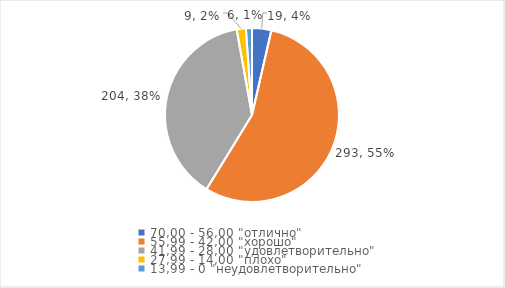
| Category | Series 0 | Series 1 |
|---|---|---|
| 70,00 - 56,00 "отлично" | 19 | 0.036 |
| 55,99 - 42,00 "хорошо" | 293 | 0.552 |
| 41,99 - 28,00 "удовлетворительно" | 204 | 0.384 |
| 27,99 - 14,00 "плохо" | 9 | 0.017 |
| 13,99 - 0 "неудовлетворительно" | 6 | 0.011 |